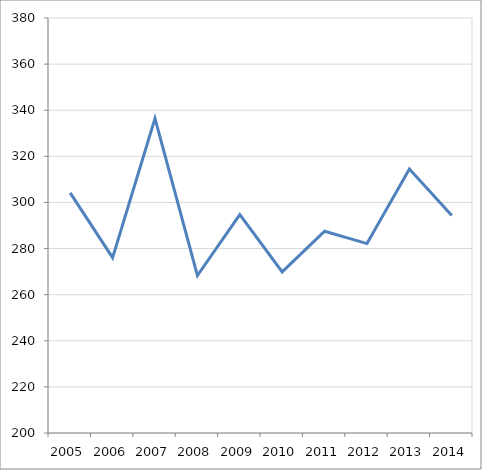
| Category | Series 0 |
|---|---|
| 2005.0 | 304.175 |
| 2006.0 | 276.041 |
| 2007.0 | 336.459 |
| 2008.0 | 268.311 |
| 2009.0 | 294.745 |
| 2010.0 | 269.872 |
| 2011.0 | 287.5 |
| 2012.0 | 282.152 |
| 2013.0 | 314.491 |
| 2014.0 | 294.348 |